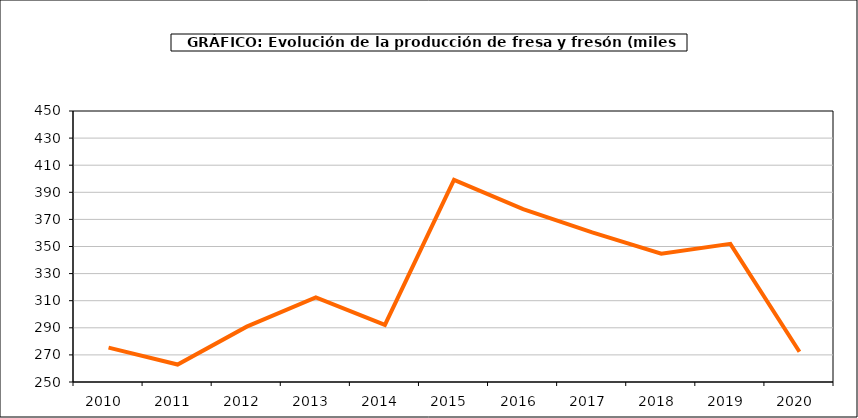
| Category | producción |
|---|---|
| 2010.0 | 275.355 |
| 2011.0 | 262.896 |
| 2012.0 | 290.843 |
| 2013.0 | 312.466 |
| 2014.0 | 292.101 |
| 2015.0 | 399.217 |
| 2016.0 | 377.596 |
| 2017.0 | 360.416 |
| 2018.0 | 344.679 |
| 2019.0 | 351.96 |
| 2020.0 | 272.345 |